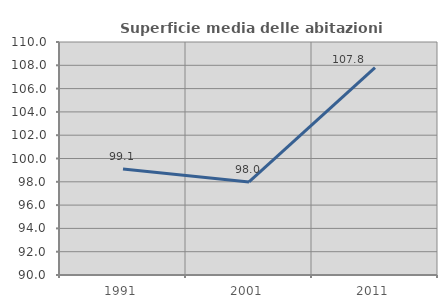
| Category | Superficie media delle abitazioni occupate |
|---|---|
| 1991.0 | 99.101 |
| 2001.0 | 97.99 |
| 2011.0 | 107.804 |